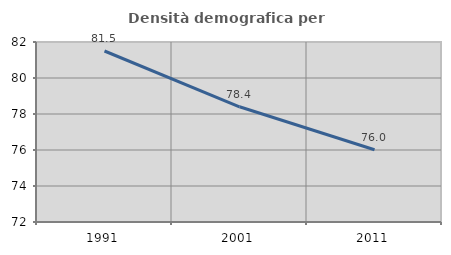
| Category | Densità demografica |
|---|---|
| 1991.0 | 81.5 |
| 2001.0 | 78.401 |
| 2011.0 | 76.012 |